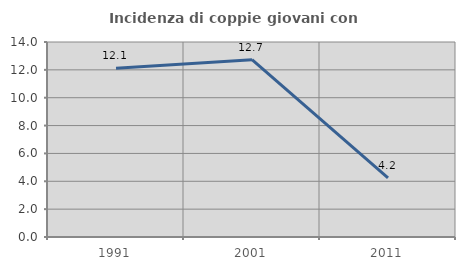
| Category | Incidenza di coppie giovani con figli |
|---|---|
| 1991.0 | 12.121 |
| 2001.0 | 12.727 |
| 2011.0 | 4.242 |